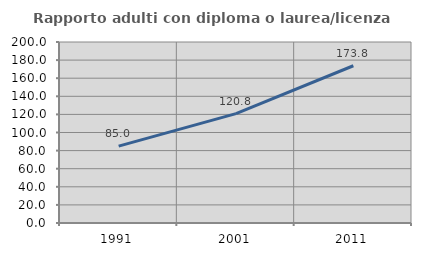
| Category | Rapporto adulti con diploma o laurea/licenza media  |
|---|---|
| 1991.0 | 84.976 |
| 2001.0 | 120.842 |
| 2011.0 | 173.762 |